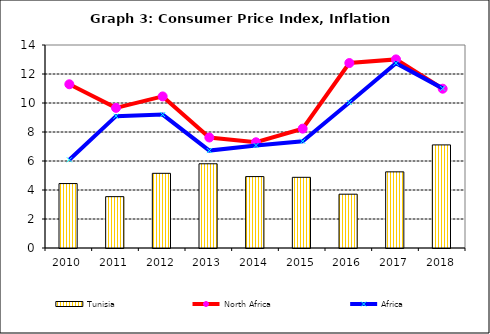
| Category | Tunisia |
|---|---|
| 2010.0 | 4.444 |
| 2011.0 | 3.542 |
| 2012.0 | 5.15 |
| 2013.0 | 5.808 |
| 2014.0 | 4.925 |
| 2015.0 | 4.875 |
| 2016.0 | 3.711 |
| 2017.0 | 5.252 |
| 2018.0 | 7.111 |